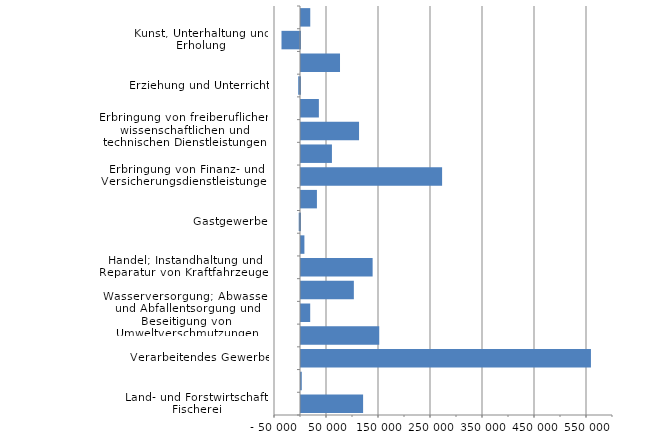
| Category | Series 0 |
|---|---|
| Land- und Forstwirtschaft, Fischerei | 119422 |
| Bergbau und Gewinnung von Steinen und Erden | 1469 |
| Verarbeitendes Gewerbe | 557573 |
| Energieversorgung | 150451 |
| Wasserversorgung; Abwasser- und Abfallentsorgung und Beseitigung von Umweltverschmutzungen | 17705 |
| Baugewerbe | 101640 |
| Handel; Instandhaltung und Reparatur von Kraftfahrzeugen | 137741 |
| Verkehr und Lagerei | 6548 |
| Gastgewerbe | -2461 |
| Information und Kommunikation | 30623 |
| Erbringung von Finanz- und Versicherungsdienstleistungen | 271343 |
| Grundstücks- und Wohnungswesen | 59484 |
| Erbringung von freiberuflichen, wissenschaftlichen und technischen Dienstleistungen | 111633 |
| Erbringung von sonstigen wirtschaftlichen Dienstleistungen | 34383 |
| Erziehung und Unterricht | -3423 |
| Gesundheits- und Sozialwesen | 75021 |
| Kunst, Unterhaltung und Erholung | -35584 |
| Erbringung von sonstigen Dienstleistungen | 17798 |